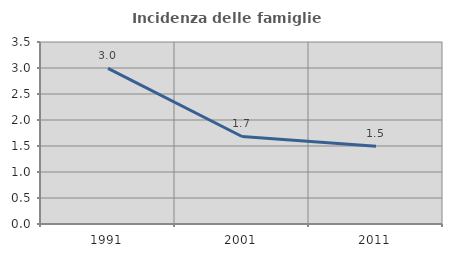
| Category | Incidenza delle famiglie numerose |
|---|---|
| 1991.0 | 2.994 |
| 2001.0 | 1.683 |
| 2011.0 | 1.496 |